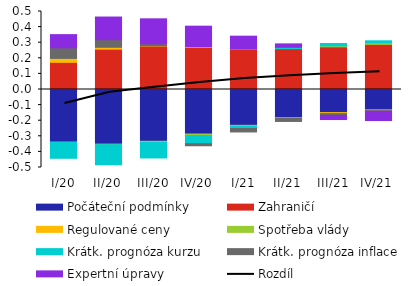
| Category | Počáteční podmínky | Zahraničí | Regulované ceny | Spotřeba vlády | Krátk. prognóza kurzu | Krátk. prognóza inflace | Expertní úpravy |
|---|---|---|---|---|---|---|---|
| I/20 | -0.336 | 0.174 | 0.025 | 0 | -0.105 | 0.068 | 0.085 |
| II/20 | -0.35 | 0.258 | 0.012 | -0.003 | -0.128 | 0.049 | 0.145 |
| III/20 | -0.332 | 0.278 | 0.002 | -0.008 | -0.099 | 0.012 | 0.161 |
| IV/20 | -0.285 | 0.27 | 0.004 | -0.01 | -0.053 | -0.013 | 0.132 |
| I/21 | -0.23 | 0.261 | 0.002 | -0.007 | -0.013 | -0.022 | 0.079 |
| II/21 | -0.181 | 0.262 | -0.003 | 0 | 0.009 | -0.02 | 0.022 |
| III/21 | -0.148 | 0.273 | -0.006 | 0.006 | 0.016 | -0.012 | -0.026 |
| IV/21 | -0.131 | 0.289 | -0.005 | 0.01 | 0.013 | -0.003 | -0.06 |